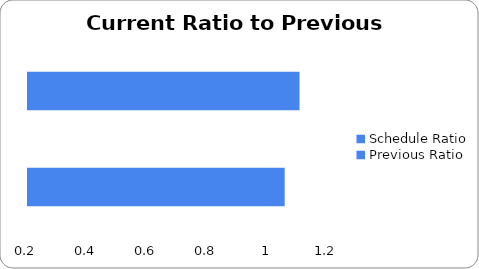
| Category | Series 0 |
|---|---|
| Schedule Ratio | 1.056 |
| Previous Ratio | 1.105 |